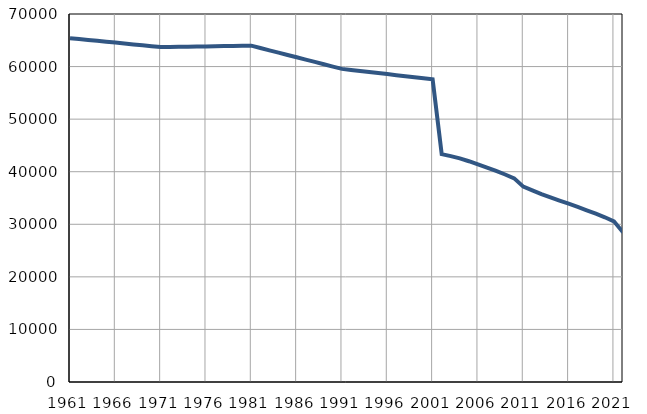
| Category | Број
становника |
|---|---|
| 1961.0 | 65409 |
| 1962.0 | 65239 |
| 1963.0 | 65068 |
| 1964.0 | 64898 |
| 1965.0 | 64728 |
| 1966.0 | 64558 |
| 1967.0 | 64386 |
| 1968.0 | 64217 |
| 1969.0 | 64047 |
| 1970.0 | 63876 |
| 1971.0 | 63706 |
| 1972.0 | 63733 |
| 1973.0 | 63759 |
| 1974.0 | 63786 |
| 1975.0 | 63813 |
| 1976.0 | 63840 |
| 1977.0 | 63866 |
| 1978.0 | 63893 |
| 1979.0 | 63920 |
| 1980.0 | 63946 |
| 1981.0 | 63973 |
| 1982.0 | 63532 |
| 1983.0 | 63090 |
| 1984.0 | 62649 |
| 1985.0 | 62207 |
| 1986.0 | 61766 |
| 1987.0 | 61325 |
| 1988.0 | 60883 |
| 1989.0 | 60442 |
| 1990.0 | 60000 |
| 1991.0 | 59559 |
| 1992.0 | 59361 |
| 1993.0 | 59163 |
| 1994.0 | 58964 |
| 1995.0 | 58766 |
| 1996.0 | 58568 |
| 1997.0 | 58370 |
| 1998.0 | 58172 |
| 1999.0 | 57974 |
| 2000.0 | 57775 |
| 2001.0 | 57577 |
| 2002.0 | 43349 |
| 2003.0 | 42958 |
| 2004.0 | 42526 |
| 2005.0 | 41995 |
| 2006.0 | 41380 |
| 2007.0 | 40764 |
| 2008.0 | 40141 |
| 2009.0 | 39470 |
| 2010.0 | 38734 |
| 2011.0 | 37164 |
| 2012.0 | 36452 |
| 2013.0 | 35735 |
| 2014.0 | 35103 |
| 2015.0 | 34497 |
| 2016.0 | 33911 |
| 2017.0 | 33304 |
| 2018.0 | 32654 |
| 2019.0 | 32007 |
| 2020.0 | 31332 |
| 2021.0 | 30561 |
| 2022.0 | 28467 |